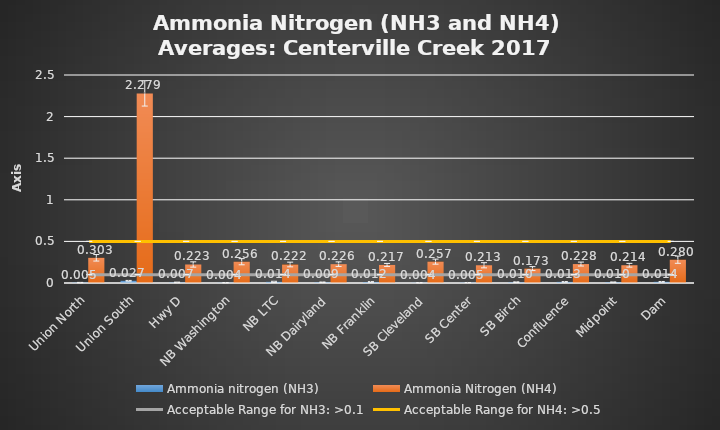
| Category | Ammonia nitrogen (NH3) | Ammonia Nitrogen (NH4) |
|---|---|---|
| Union North | 0.005 | 0.303 |
| Union South | 0.027 | 2.279 |
| Hwy D | 0.007 | 0.223 |
| NB Washington | 0.004 | 0.256 |
| NB LTC | 0.014 | 0.222 |
| NB Dairyland | 0.009 | 0.226 |
| NB Franklin | 0.012 | 0.217 |
| SB Cleveland | 0.004 | 0.257 |
| SB Center | 0.005 | 0.213 |
| SB Birch | 0.01 | 0.173 |
| Confluence | 0.013 | 0.228 |
| Midpoint | 0.01 | 0.214 |
| Dam | 0.014 | 0.28 |